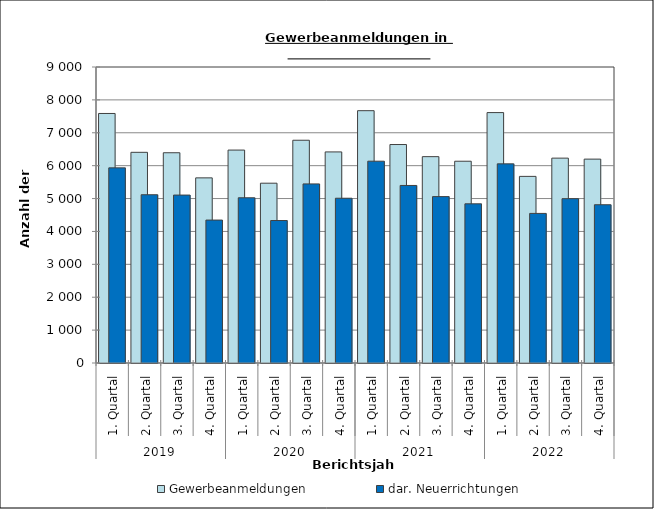
| Category | Gewerbeanmeldungen | dar. Neuerrichtungen |
|---|---|---|
| 0 | 7587 | 5933 |
| 1 | 6406 | 5116 |
| 2 | 6393 | 5106 |
| 3 | 5629 | 4346 |
| 4 | 6474 | 5024 |
| 5 | 5467 | 4332 |
| 6 | 6773 | 5445 |
| 7 | 6418 | 5010 |
| 8 | 7672 | 6136 |
| 9 | 6643 | 5398 |
| 10 | 6274 | 5059 |
| 11 | 6135 | 4840 |
| 12 | 7614 | 6055 |
| 13 | 5674 | 4548 |
| 14 | 6229 | 4996 |
| 15 | 6199 | 4812 |